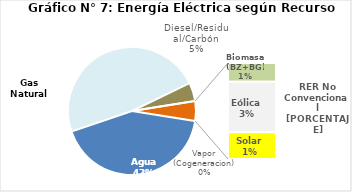
| Category | Series 0 |
|---|---|
| Agua | 1990.482 |
| Gas Natural | 2263.645 |
| Diesel/Residual/Carbón | 218.416 |
| Vapor (Cogeneracion) | 0.379 |
| Biomasa (BZ+BG) | 46.475 |
| Eólica | 124.757 |
| Solar | 66.063 |